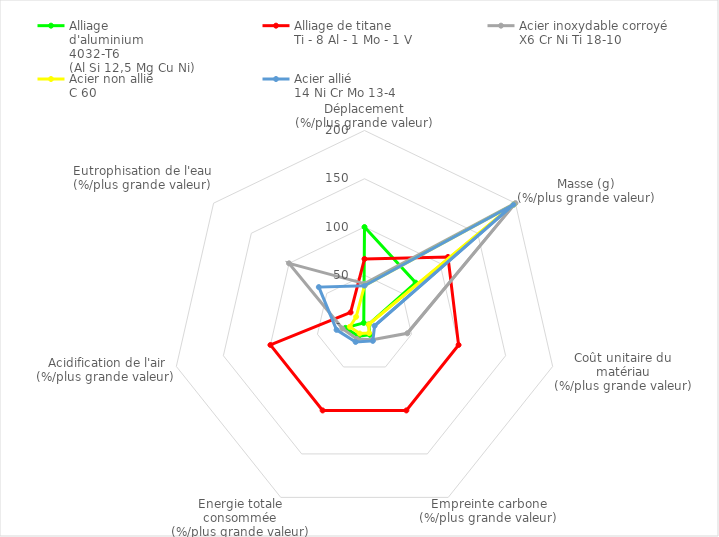
| Category | Alliage
d'aluminium
4032-T6
(Al Si 12,5 Mg Cu Ni) | Alliage de titane
Ti - 8 Al - 1 Mo - 1 V | Acier inoxydable corroyé
X6 Cr Ni Ti 18-10 | Acier non allié
C 60 | Acier allié
14 Ni Cr Mo 13-4 |
|---|---|---|---|---|---|
| Déplacement
(%/plus grande valeur) | 100 | 66.877 | 41.29 | 39.231 | 39.231 |
| Masse (g)
(%/plus grande valeur) | 67.848 | 110.633 | 200 | 197.47 | 197.47 |
| Coût unitaire du matériau
(%/plus grande valeur) | 4.464 | 100 | 45.536 | 4.464 | 10.714 |
| Empreinte carbone
(%/plus grande valeur) | 13 | 100 | 18.667 | 11 | 20 |
| Energie totale consommée
(%/plus grande valeur) | 14.545 | 100 | 17.879 | 11.515 | 21.212 |
|  Acidification de l'air
(%/plus grande valeur) | 20.312 | 100 | 23.438 | 15.625 | 29.688 |
| Eutrophisation de l'eau
(%/plus grande valeur) | 0.974 | 18.421 | 100 | 11.053 | 60.526 |